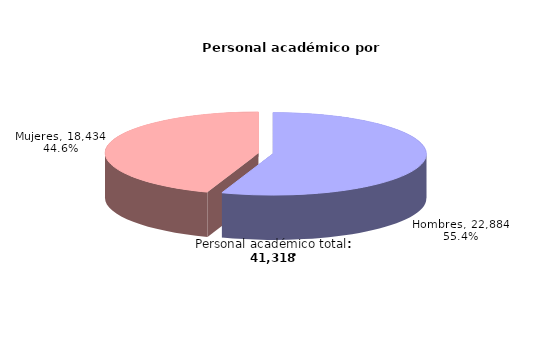
| Category | Series 0 | Series 1 |
|---|---|---|
| Hombres | 22884 | 55.385 |
| Mujeres | 18434 | 44.615 |